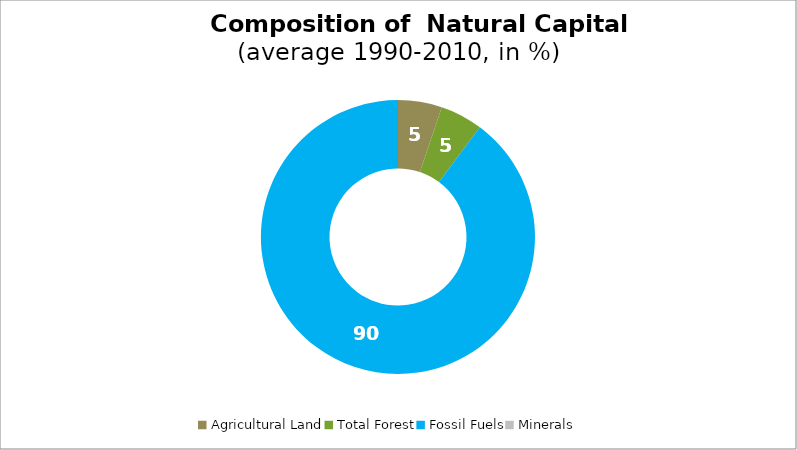
| Category | Series 0 |
|---|---|
| Agricultural Land | 5.176 |
| Total Forest | 5.023 |
| Fossil Fuels | 89.8 |
| Minerals | 0 |